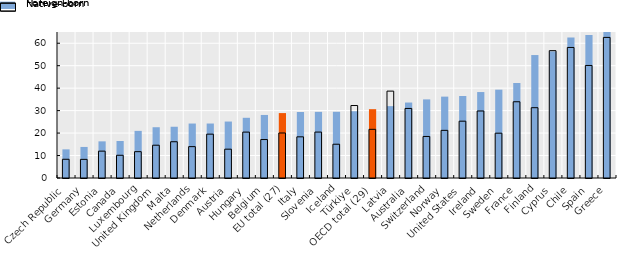
| Category | Foreign-born | Native-born |
|---|---|---|
| Czech Republic | 12.752 | 8.335 |
| Germany | 13.827 | 8.296 |
| Estonia | 16.317 | 11.96 |
| Canada | 16.476 | 10.118 |
| Luxembourg | 20.98 | 11.728 |
| United Kingdom | 22.604 | 14.596 |
| Malta | 22.817 | 16.139 |
| Netherlands | 24.25 | 13.963 |
| Denmark | 24.254 | 19.524 |
| Austria | 25.137 | 12.83 |
| Hungary | 26.805 | 20.435 |
| Belgium | 28.068 | 17.123 |
| EU total (27) | 28.901 | 20.04 |
| Italy | 29.397 | 18.329 |
| Slovenia | 29.448 | 20.451 |
| Iceland | 29.475 | 15.038 |
| Türkiye | 29.726 | 32.269 |
| OECD total (29) | 30.641 | 21.666 |
| Latvia | 31.99 | 38.684 |
| Australia | 33.596 | 30.966 |
| Switzerland | 34.999 | 18.493 |
| Norway | 36.226 | 21.217 |
| United States | 36.52 | 25.3 |
| Ireland | 38.265 | 29.83 |
| Sweden | 39.326 | 19.947 |
| France | 42.299 | 33.945 |
| Finland | 54.741 | 31.302 |
| Cyprus | 56.36 | 56.693 |
| Chile | 62.6 | 58.12 |
| Spain | 63.679 | 50.102 |
| Greece | 77.876 | 62.587 |